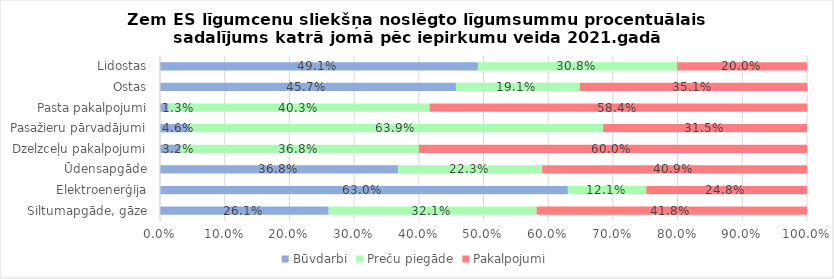
| Category | Būvdarbi | Series 2 | Preču piegāde | Series 4 | Pakalpojumi |
|---|---|---|---|---|---|
| Siltumapgāde, gāze | 0.261 |  | 0.321 |  | 0.418 |
| Elektroenerģija | 0.63 |  | 0.121 |  | 0.248 |
| Ūdensapgāde | 0.368 |  | 0.223 |  | 0.409 |
| Dzelzceļu pakalpojumi | 0.032 |  | 0.368 |  | 0.6 |
| Pasažieru pārvadājumi | 0.046 |  | 0.639 |  | 0.315 |
| Pasta pakalpojumi | 0.013 |  | 0.403 |  | 0.584 |
| Ostas | 0.457 |  | 0.191 |  | 0.351 |
| Lidostas | 0.491 |  | 0.308 |  | 0.2 |